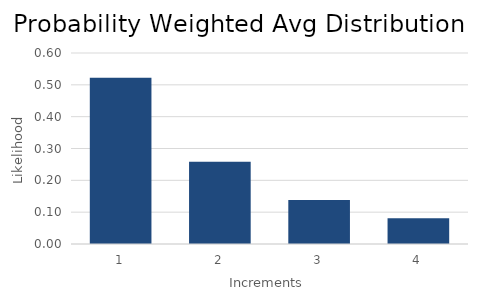
| Category | Series 0 |
|---|---|
| 0 | 0.522 |
| 1 | 0.258 |
| 2 | 0.138 |
| 3 | 0.081 |